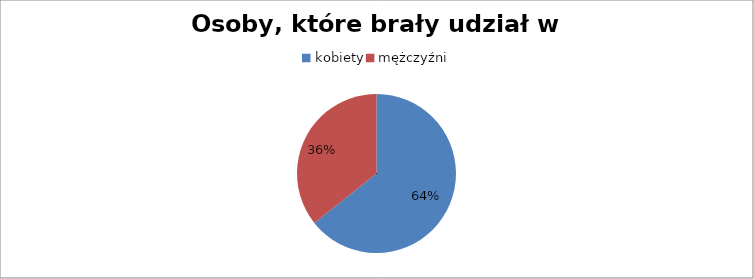
| Category | Osoby, które brały udział w ankiecie  |
|---|---|
| kobiety | 18 |
| mężczyźni | 10 |